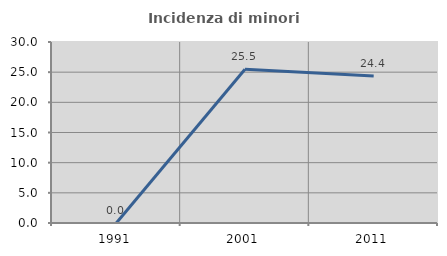
| Category | Incidenza di minori stranieri |
|---|---|
| 1991.0 | 0 |
| 2001.0 | 25.49 |
| 2011.0 | 24.352 |